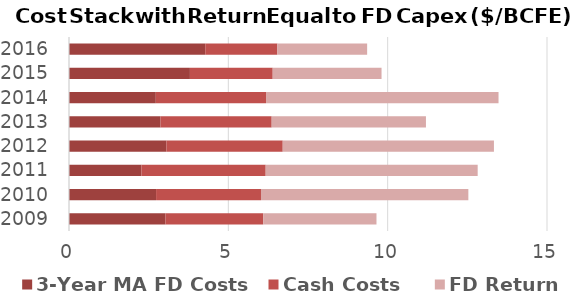
| Category | 3-Year MA FD Costs | Cash Costs | FD Return |
|---|---|---|---|
| 2009 | 3.027 | 3.068 | 3.555 |
| 2010 | 2.732 | 3.293 | 6.507 |
| 2011 | 2.273 | 3.899 | 6.653 |
| 2012 | 3.056 | 3.651 | 6.628 |
| 2013 | 2.871 | 3.489 | 4.841 |
| 2014 | 2.724 | 3.459 | 7.296 |
| 2015 | 3.795 | 2.598 | 3.415 |
| 2016 | 4.276 | 2.263 | 2.817 |